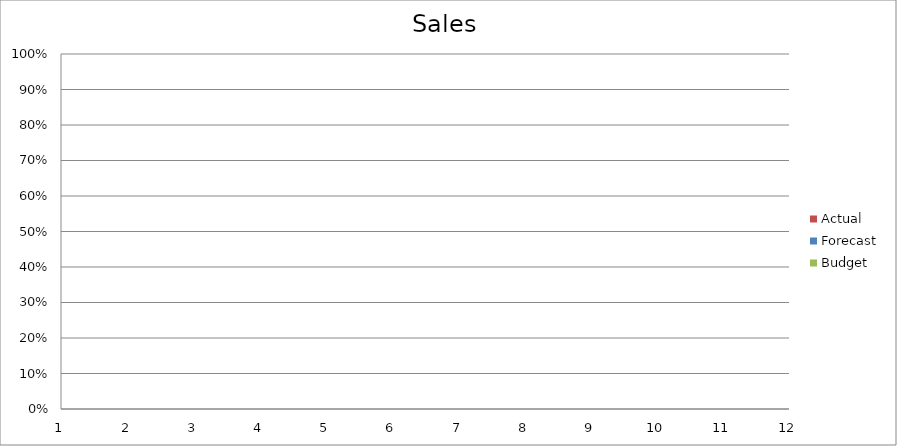
| Category | Budget | Forecast | Actual |
|---|---|---|---|
| 0 | 1760 | 3140 | 1970 |
| 1 | 2580 | 3180 | 1740 |
| 2 | 1780 | 2570 | 1600 |
| 3 | 1560 | 1960 | 2270 |
| 4 | 2920 | 2400 | 2840 |
| 5 | 1920 | 1150 | 1600 |
| 6 | 1950 | 2160 | 2320 |
| 7 | 1270 | 1810 | 2880 |
| 8 | 2560 | 2620 | 1990 |
| 9 | 2370 | 2660 | 500 |
| 10 | 530 | 1710 | 2190 |
| 11 | 1360 | 1650 | 2080 |